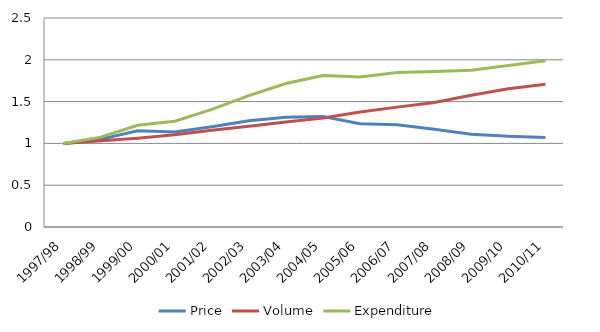
| Category | Price | Volume | Expenditure |
|---|---|---|---|
| 1997/98 | 1 | 1 | 1 |
| 1998/99 | 1.05 | 1.031 | 1.075 |
| 1999/00 | 1.15 | 1.063 | 1.217 |
| 2000/01 | 1.138 | 1.102 | 1.266 |
| 2001/02 | 1.199 | 1.156 | 1.407 |
| 2002/03 | 1.27 | 1.206 | 1.572 |
| 2003/04 | 1.314 | 1.256 | 1.717 |
| 2004/05 | 1.322 | 1.305 | 1.813 |
| 2005/06 | 1.235 | 1.375 | 1.795 |
| 2006/07 | 1.223 | 1.434 | 1.848 |
| 2007/08 | 1.168 | 1.489 | 1.86 |
| 2008/09 | 1.11 | 1.576 | 1.876 |
| 2009/10 | 1.085 | 1.653 | 1.931 |
| 2010/11 | 1.071 | 1.706 | 1.989 |